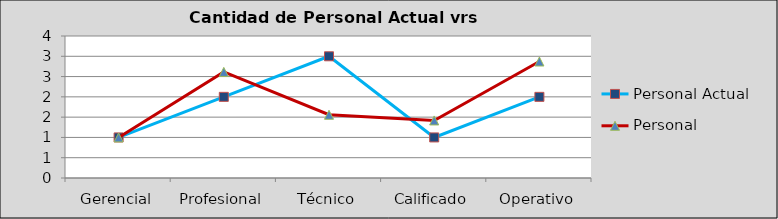
| Category | Personal Actual | Personal Requerido |
|---|---|---|
| Gerencial | 1 | 1 |
| Profesional | 2 | 2.615 |
| Técnico | 3 | 1.559 |
| Calificado | 1 | 1.419 |
| Operativo | 2 | 2.871 |